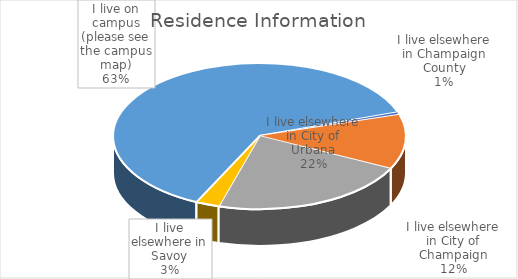
| Category | Series 0 |
|---|---|
| I live elsewhere in Champaign County | 2 |
| I live elsewhere in City of Champaign | 42 |
| I live elsewhere in City of Urbana | 77 |
| I live elsewhere in Savoy | 9 |
| I live on campus (please see the campus map) | 218 |